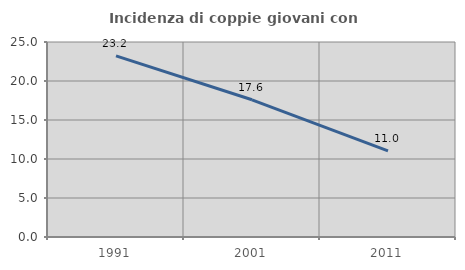
| Category | Incidenza di coppie giovani con figli |
|---|---|
| 1991.0 | 23.219 |
| 2001.0 | 17.592 |
| 2011.0 | 11.031 |